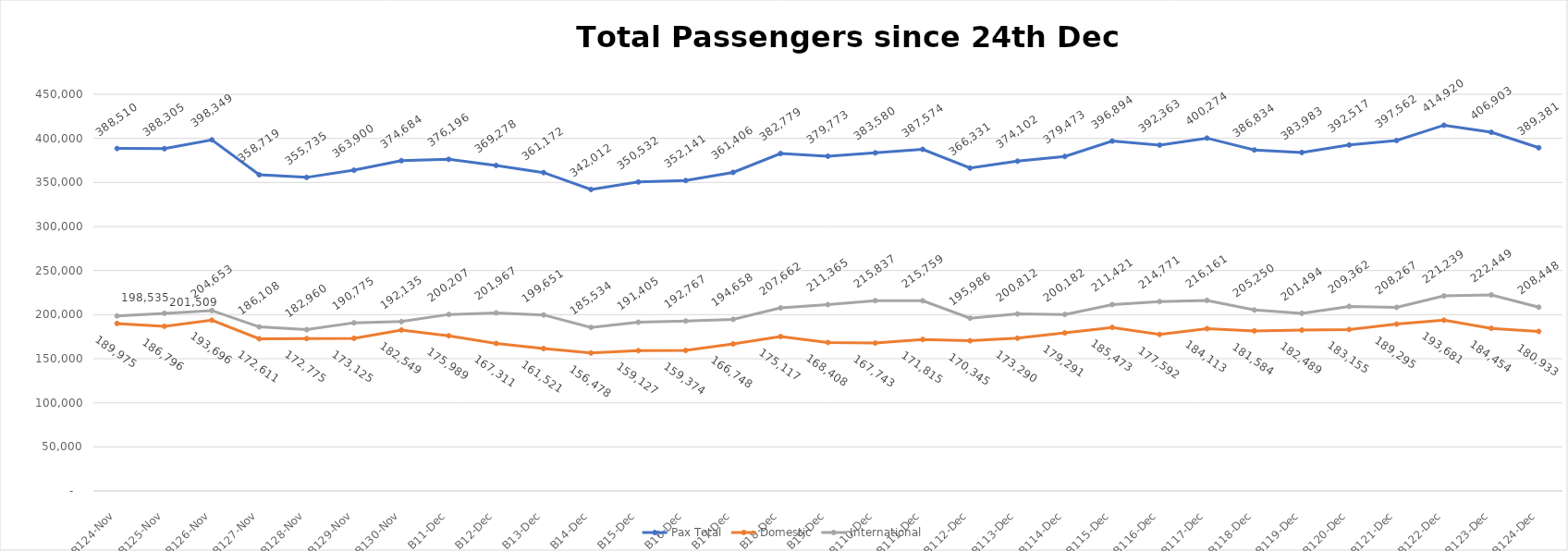
| Category | Pax Total | Domestic | International |
|---|---|---|---|
| 2023-11-24 | 388510 | 189975 | 198535 |
| 2023-11-25 | 388305 | 186796 | 201509 |
| 2023-11-26 | 398349 | 193696 | 204653 |
| 2023-11-27 | 358719 | 172611 | 186108 |
| 2023-11-28 | 355735 | 172775 | 182960 |
| 2023-11-29 | 363900 | 173125 | 190775 |
| 2023-11-30 | 374684 | 182549 | 192135 |
| 2023-12-01 | 376196 | 175989 | 200207 |
| 2023-12-02 | 369278 | 167311 | 201967 |
| 2023-12-03 | 361172 | 161521 | 199651 |
| 2023-12-04 | 342012 | 156478 | 185534 |
| 2023-12-05 | 350532 | 159127 | 191405 |
| 2023-12-06 | 352141 | 159374 | 192767 |
| 2023-12-07 | 361406 | 166748 | 194658 |
| 2023-12-08 | 382779 | 175117 | 207662 |
| 2023-12-09 | 379773 | 168408 | 211365 |
| 2023-12-10 | 383580 | 167743 | 215837 |
| 2023-12-11 | 387574 | 171815 | 215759 |
| 2023-12-12 | 366331 | 170345 | 195986 |
| 2023-12-13 | 374102 | 173290 | 200812 |
| 2023-12-14 | 379473 | 179291 | 200182 |
| 2023-12-15 | 396894 | 185473 | 211421 |
| 2023-12-16 | 392363 | 177592 | 214771 |
| 2023-12-17 | 400274 | 184113 | 216161 |
| 2023-12-18 | 386834 | 181584 | 205250 |
| 2023-12-19 | 383983 | 182489 | 201494 |
| 2023-12-20 | 392517 | 183155 | 209362 |
| 2023-12-21 | 397562 | 189295 | 208267 |
| 2023-12-22 | 414920 | 193681 | 221239 |
| 2023-12-23 | 406903 | 184454 | 222449 |
| 2023-12-24 | 389381 | 180933 | 208448 |